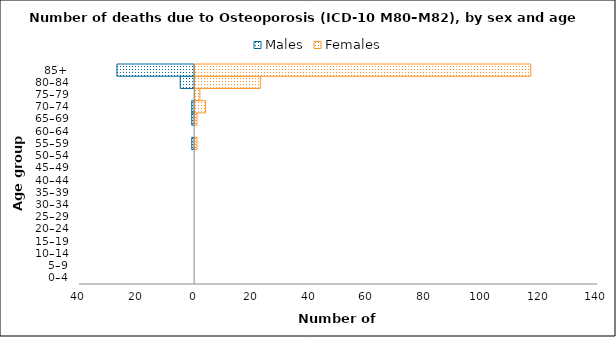
| Category | Males | Females |
|---|---|---|
| 0–4 | 0 | 0 |
| 5–9 | 0 | 0 |
| 10–14 | 0 | 0 |
| 15–19 | 0 | 0 |
| 20–24 | 0 | 0 |
| 25–29 | 0 | 0 |
| 30–34 | 0 | 0 |
| 35–39 | 0 | 0 |
| 40–44 | 0 | 0 |
| 45–49 | 0 | 0 |
| 50–54 | 0 | 0 |
| 55–59 | -1 | 1 |
| 60–64 | 0 | 0 |
| 65–69 | -1 | 1 |
| 70–74 | -1 | 4 |
| 75–79 | 0 | 2 |
| 80–84 | -5 | 23 |
| 85+ | -27 | 117 |